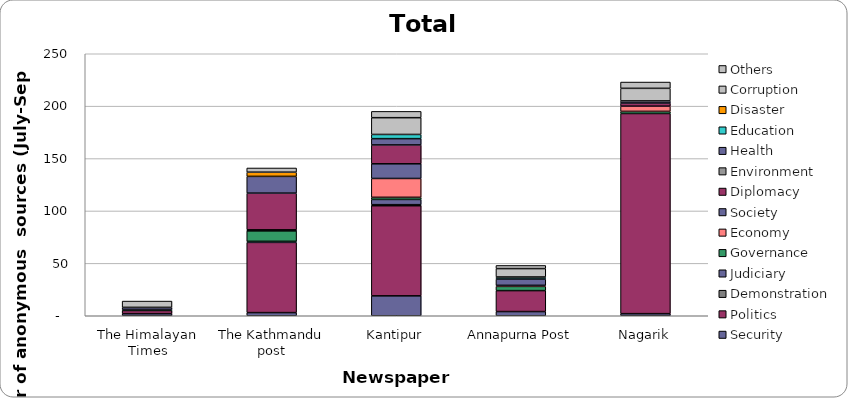
| Category | Security | Politics | Demonstration | Judiciary | Governance | Economy | Society | Diplomacy | Environment | Health | Education | Disaster | Corruption | Others |
|---|---|---|---|---|---|---|---|---|---|---|---|---|---|---|
| The Himalayan Times | 2 | 3 | 0 | 0 | 1 | 0 | 0 | 0 | 0 | 2 | 0 | 0 | 0 | 6 |
| The Kathmandu post | 3 | 67 | 0 | 1 | 10 | 0 | 1 | 35 | 0 | 16 | 0 | 4 | 4 | 0 |
| Kantipur | 19 | 86 | 1 | 5 | 2 | 18 | 14 | 18 | 0 | 6 | 4 | 0 | 16 | 6 |
| Annapurna Post | 4 | 20 | 0 | 0 | 4 | 1 | 6 | 0 | 0 | 1 | 1 | 0 | 8 | 3 |
| Nagarik | 2 | 191 | 0 | 0 | 2 | 5 | 0 | 3 | 0 | 2 | 0 | 0 | 12 | 6 |